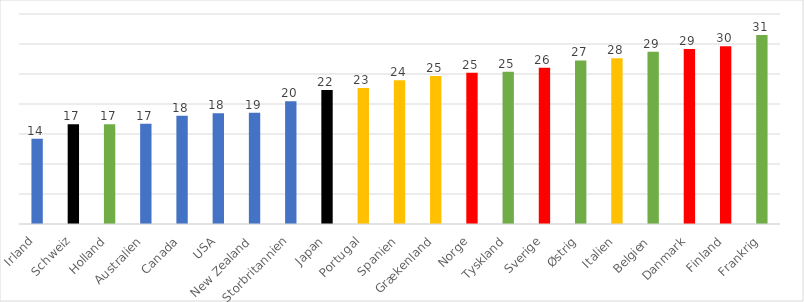
| Category | Offentlige bruttoudgifter til velfærd |
|---|---|
| Irland | 14.224 |
| Schweiz | 16.608 |
| Holland | 16.609 |
| Australien | 16.71 |
| Canada | 18.022 |
| USA | 18.439 |
| New Zealand | 18.555 |
| Storbritannien | 20.473 |
| Japan | 22.324 |
| Portugal | 22.662 |
| Spanien | 23.943 |
| Grækenland | 24.658 |
| Norge | 25.212 |
| Tyskland | 25.37 |
| Sverige | 26.047 |
| Østrig | 27.263 |
| Italien | 27.645 |
| Belgien | 28.718 |
| Danmark | 29.164 |
| Finland | 29.626 |
| Frankrig | 31.5 |